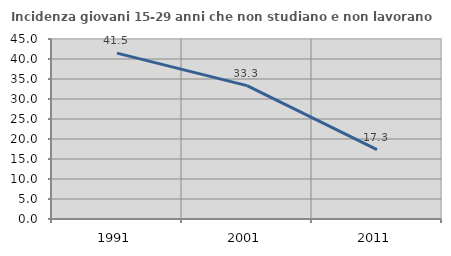
| Category | Incidenza giovani 15-29 anni che non studiano e non lavorano  |
|---|---|
| 1991.0 | 41.466 |
| 2001.0 | 33.333 |
| 2011.0 | 17.347 |